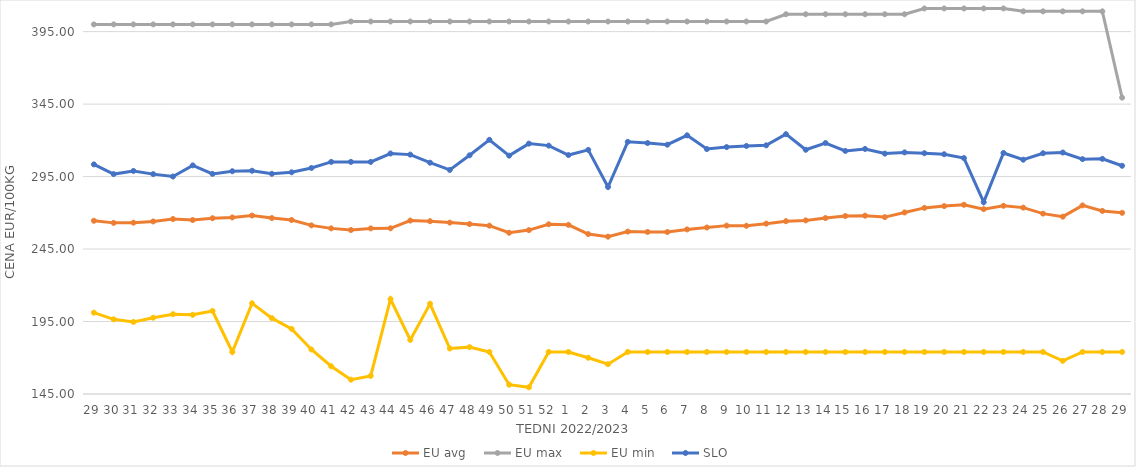
| Category | EU avg | EU max | EU min | SLO |
|---|---|---|---|---|
| 29.0 | 264.52 | 400 | 201.097 | 303.41 |
| 30.0 | 263.067 | 400 | 196.496 | 296.73 |
| 31.0 | 263.196 | 400 | 194.756 | 298.88 |
| 32.0 | 264.059 | 400 | 197.634 | 296.7 |
| 33.0 | 265.729 | 400 | 200.07 | 295.05 |
| 34.0 | 265.016 | 400 | 199.637 | 302.73 |
| 35.0 | 266.273 | 400 | 202.277 | 296.86 |
| 36.0 | 266.807 | 400 | 174 | 298.7 |
| 37.0 | 268.136 | 400 | 207.594 | 299.02 |
| 38.0 | 266.39 | 400 | 197.352 | 296.91 |
| 39.0 | 265.059 | 400 | 189.926 | 297.96 |
| 40.0 | 261.35 | 400 | 175.723 | 300.95 |
| 41.0 | 259.271 | 400 | 164.165 | 305.13 |
| 42.0 | 258.146 | 402 | 154.869 | 305.13 |
| 43.0 | 259.256 | 402 | 157.459 | 305.13 |
| 44.0 | 259.32 | 402 | 210.415 | 310.93 |
| 45.0 | 264.649 | 402 | 182.35 | 310.16 |
| 46.0 | 264.228 | 402 | 207.247 | 304.58 |
| 47.0 | 263.24 | 402 | 176.378 | 299.59 |
| 48.0 | 262.225 | 402 | 177.332 | 309.69 |
| 49.0 | 261.152 | 402 | 174 | 320.38 |
| 50.0 | 256.24 | 402 | 151.434 | 309.44 |
| 51.0 | 258.071 | 402 | 149.638 | 317.74 |
| 52.0 | 262.088 | 402 | 174 | 316.36 |
| 1.0 | 261.716 | 402 | 174 | 309.84 |
| 2.0 | 255.331 | 402 | 169.983 | 313.4 |
| 3.0 | 253.546 | 402 | 165.574 | 287.81 |
| 4.0 | 257.051 | 402 | 174 | 318.98 |
| 5.0 | 256.808 | 402 | 174 | 318.13 |
| 6.0 | 256.75 | 402 | 174 | 316.99 |
| 7.0 | 258.565 | 402 | 174 | 323.47 |
| 8.0 | 259.872 | 402 | 174 | 314 |
| 9.0 | 261.164 | 402 | 174 | 315.35 |
| 10.0 | 261.06 | 402 | 174 | 316.13 |
| 11.0 | 262.513 | 402 | 174 | 316.55 |
| 12.0 | 264.228 | 407 | 174 | 324.27 |
| 13.0 | 264.768 | 407 | 174 | 313.49 |
| 14.0 | 266.385 | 407 | 174 | 318.17 |
| 15.0 | 267.797 | 407 | 174 | 312.7 |
| 16.0 | 268.021 | 407 | 174 | 314.07 |
| 17.0 | 267.041 | 407 | 174 | 310.87 |
| 18.0 | 270.255 | 407 | 174 | 311.69 |
| 19.0 | 273.406 | 411 | 174 | 311.13 |
| 20.0 | 274.631 | 411 | 174 | 310.42 |
| 21.0 | 275.561 | 411 | 174 | 307.76 |
| 22.0 | 272.542 | 411 | 174 | 277.34 |
| 23.0 | 274.85 | 411 | 174 | 311.28 |
| 24.0 | 273.59 | 409 | 174 | 306.64 |
| 25.0 | 269.439 | 409 | 174 | 311.1 |
| 26.0 | 267.345 | 409 | 167.858 | 311.62 |
| 27.0 | 275.123 | 409 | 174 | 307.04 |
| 28.0 | 271.32 | 409 | 174 | 307.23 |
| 29.0 | 269.989 | 349.45 | 174 | 302.45 |